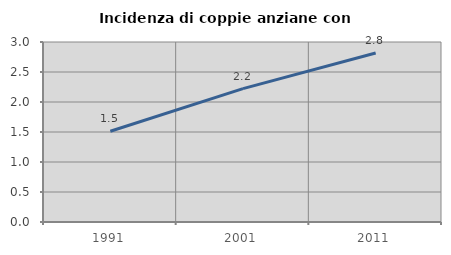
| Category | Incidenza di coppie anziane con figli |
|---|---|
| 1991.0 | 1.513 |
| 2001.0 | 2.224 |
| 2011.0 | 2.816 |